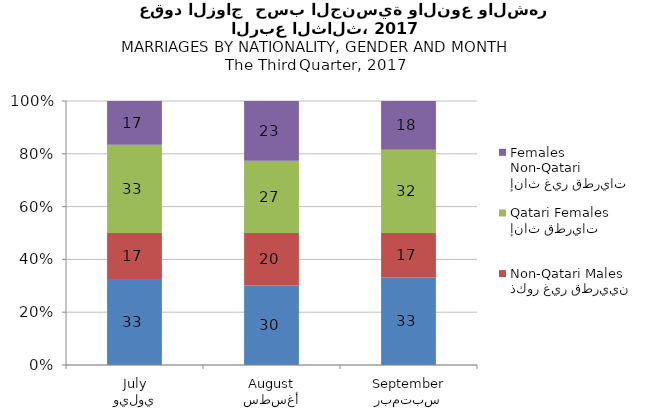
| Category | ذكور قطريون
Qatari Males | ذكور غير قطريين
Non-Qatari Males | إناث قطريات
Qatari Females | إناث غير قطريات
Non-Qatari Females |
|---|---|---|---|---|
| يوليو
July | 32.609 | 17.391 | 33.445 | 16.555 |
| أغسطس
August | 30.133 | 19.867 | 27.333 | 22.667 |
| سبتمبر
September | 33.099 | 16.901 | 31.514 | 18.486 |